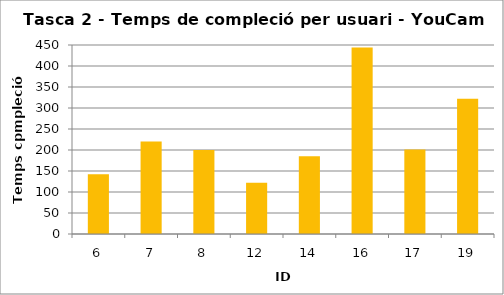
| Category | Temps de compleció (s) |
|---|---|
| 6.0 | 142 |
| 7.0 | 220 |
| 8.0 | 200 |
| 12.0 | 122 |
| 14.0 | 185 |
| 16.0 | 444 |
| 17.0 | 201 |
| 19.0 | 322 |